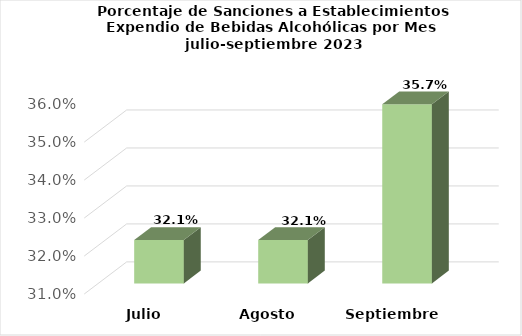
| Category | Series 0 |
|---|---|
| Julio | 0.321 |
| Agosto | 0.321 |
| Septiembre | 0.357 |